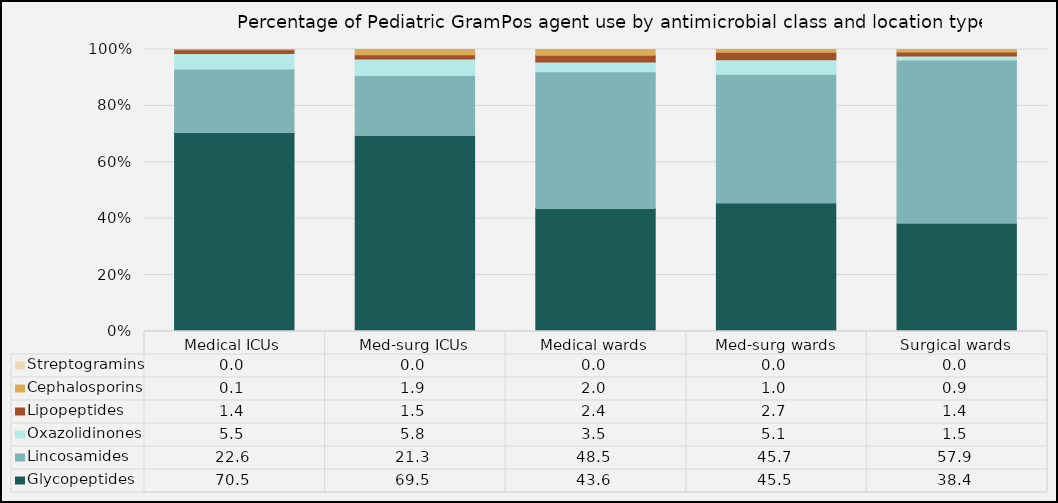
| Category | Glycopeptides | Lincosamides | Oxazolidinones | Lipopeptides | Cephalosporins | Streptogramins |
|---|---|---|---|---|---|---|
| Medical ICUs | 70.52 | 22.59 | 5.46 | 1.37 | 0.05 | 0 |
| Med-surg ICUs | 69.53 | 21.28 | 5.84 | 1.46 | 1.89 | 0 |
| Medical wards | 43.63 | 48.49 | 3.47 | 2.41 | 2 | 0 |
| Med-surg wards | 45.53 | 45.71 | 5.13 | 2.66 | 0.98 | 0 |
| Surgical wards | 38.38 | 57.88 | 1.45 | 1.41 | 0.89 | 0 |